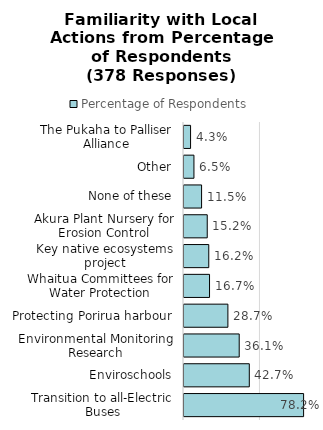
| Category | Percentage of Respondents |
|---|---|
| Transition to all-Electric Buses | 0.782 |
| Enviroschools | 0.427 |
| Environmental Monitoring Research | 0.361 |
| Protecting Porirua harbour | 0.287 |
| Whaitua Committees for Water Protection | 0.167 |
| Key native ecosystems project | 0.162 |
| Akura Plant Nursery for Erosion Control | 0.152 |
| None of these | 0.115 |
| Other | 0.065 |
| The Pukaha to Palliser Alliance | 0.043 |